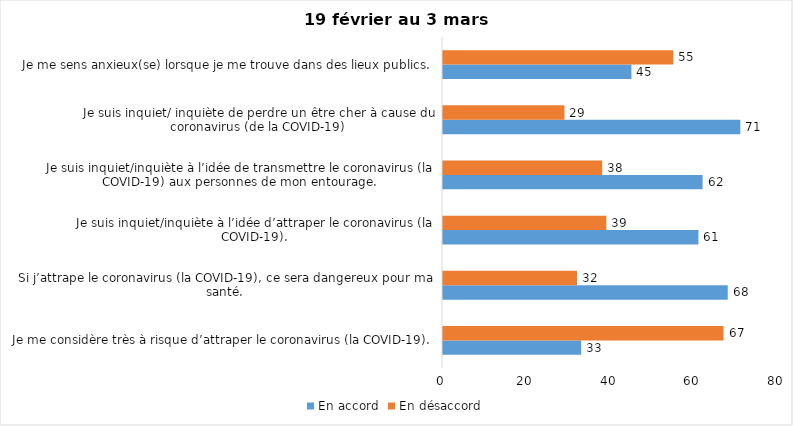
| Category | En accord | En désaccord |
|---|---|---|
| Je me considère très à risque d’attraper le coronavirus (la COVID-19). | 33 | 67 |
| Si j’attrape le coronavirus (la COVID-19), ce sera dangereux pour ma santé. | 68 | 32 |
| Je suis inquiet/inquiète à l’idée d’attraper le coronavirus (la COVID-19). | 61 | 39 |
| Je suis inquiet/inquiète à l’idée de transmettre le coronavirus (la COVID-19) aux personnes de mon entourage. | 62 | 38 |
| Je suis inquiet/ inquiète de perdre un être cher à cause du coronavirus (de la COVID-19) | 71 | 29 |
| Je me sens anxieux(se) lorsque je me trouve dans des lieux publics. | 45 | 55 |